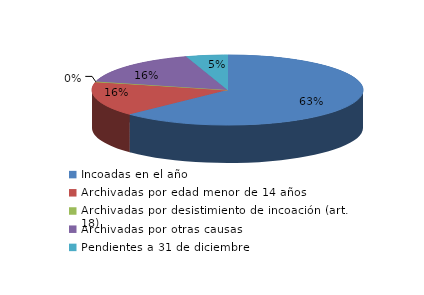
| Category | Series 0 |
|---|---|
| Incoadas en el año | 179 |
| Archivadas por edad menor de 14 años | 45 |
| Archivadas por desistimiento de incoación (art. 18) | 1 |
| Archivadas por otras causas | 46 |
| Pendientes a 31 de diciembre | 14 |